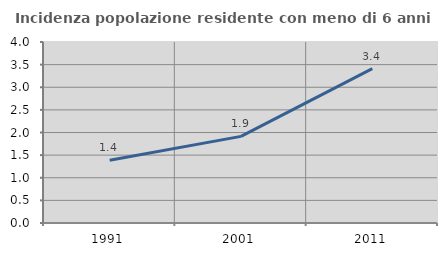
| Category | Incidenza popolazione residente con meno di 6 anni |
|---|---|
| 1991.0 | 1.389 |
| 2001.0 | 1.915 |
| 2011.0 | 3.412 |